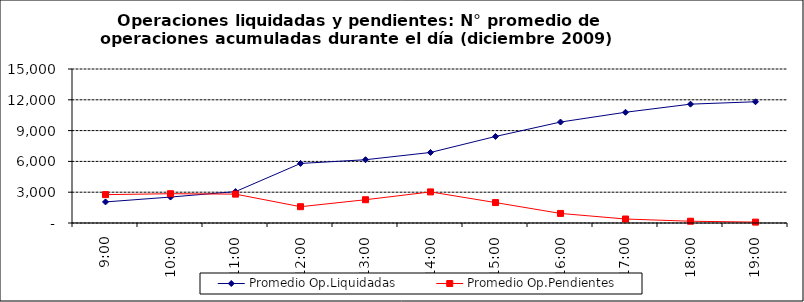
| Category | Promedio Op.Liquidadas | Promedio Op.Pendientes |
|---|---|---|
| 0.375 | 2052.6 | 2763 |
| 0.4166666666666667 | 2527.5 | 2852 |
| 0.4583333333333333 | 3058 | 2813.15 |
| 0.5 | 5799.35 | 1587.3 |
| 0.5416666666666666 | 6163.3 | 2266.2 |
| 0.5833333333333334 | 6870.45 | 3027.85 |
| 0.625 | 8429.5 | 1989.15 |
| 0.6666666666666666 | 9833.2 | 931.95 |
| 0.7083333333333334 | 10786.7 | 388.85 |
| 0.75 | 11576.7 | 173.45 |
| 0.7916666666666666 | 11808.55 | 86.6 |